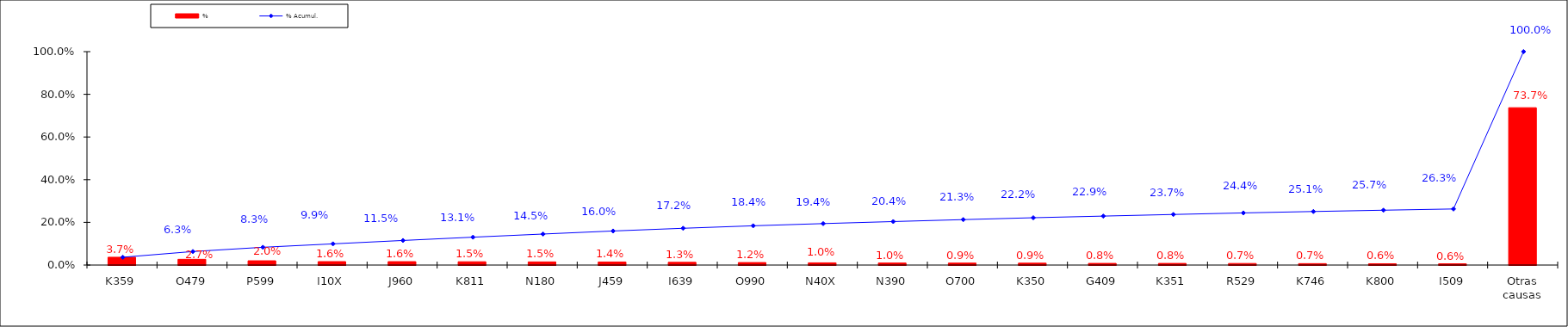
| Category | % |
|---|---|
| K359 | 0.037 |
| O479 | 0.027 |
| P599 | 0.02 |
| I10X | 0.016 |
| J960 | 0.016 |
| K811 | 0.015 |
| N180 | 0.015 |
| J459 | 0.014 |
| I639 | 0.013 |
| O990 | 0.012 |
| N40X | 0.01 |
| N390 | 0.01 |
| O700 | 0.009 |
| K350 | 0.009 |
| G409 | 0.008 |
| K351 | 0.008 |
| R529 | 0.007 |
| K746 | 0.007 |
| K800 | 0.006 |
| I509 | 0.006 |
| Otras causas | 0.737 |